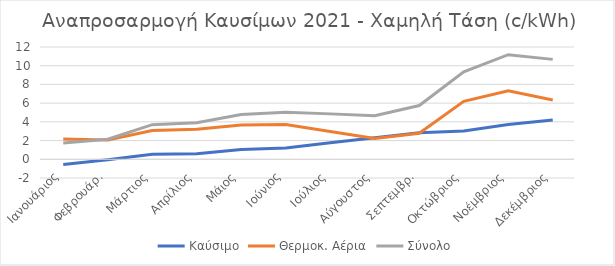
| Category | Καύσιμο | Θερμοκ. Αέρια | Σύνολο |
|---|---|---|---|
| Ιανουάριος | -0.555 | 2.159 | 1.735 |
| Φεβρουάρ. | -0.058 | 2.07 | 2.138 |
| Μάρτιος | 0.533 | 3.067 | 3.704 |
| Απρίλιος | 0.602 | 3.207 | 3.91 |
| Μάιος | 1.049 | 3.671 | 4.79 |
| Ιούνιος | 1.219 | 3.728 | 5.022 |
| Ιούλιος | 1.765 | 2.964 | 4.853 |
| Αύγουστος | 2.302 | 2.234 | 4.652 |
| Σεπτεμβρ. | 2.834 | 2.779 | 5.744 |
| Οκτώβριος | 3.024 | 6.188 | 9.345 |
| Νοέμβριος | 3.708 | 7.333 | 11.177 |
| Δεκέμβριος | 4.21 | 6.334 | 10.678 |